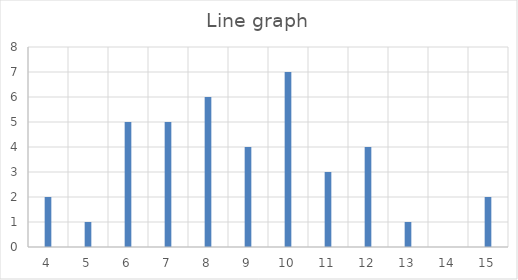
| Category | Series 0 |
|---|---|
| 4.0 | 2 |
| 5.0 | 1 |
| 6.0 | 5 |
| 7.0 | 5 |
| 8.0 | 6 |
| 9.0 | 4 |
| 10.0 | 7 |
| 11.0 | 3 |
| 12.0 | 4 |
| 13.0 | 1 |
| 14.0 | 0 |
| 15.0 | 2 |